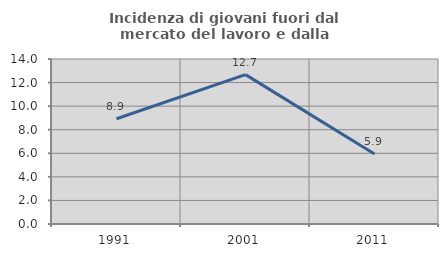
| Category | Incidenza di giovani fuori dal mercato del lavoro e dalla formazione  |
|---|---|
| 1991.0 | 8.929 |
| 2001.0 | 12.676 |
| 2011.0 | 5.941 |